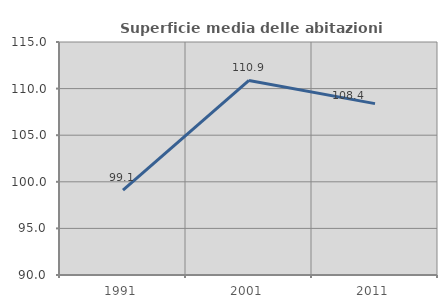
| Category | Superficie media delle abitazioni occupate |
|---|---|
| 1991.0 | 99.113 |
| 2001.0 | 110.878 |
| 2011.0 | 108.388 |